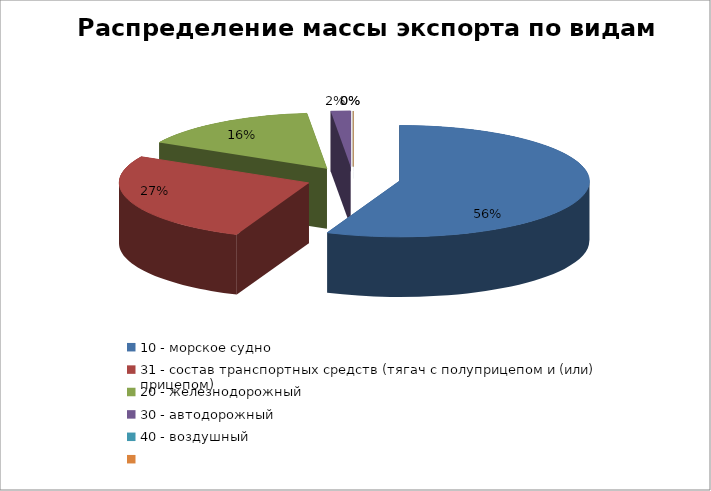
| Category | Масса, тонн |
|---|---|
| 10 - морское судно | 4586.574 |
| 31 - состав транспортных средств (тягач с полуприцепом и (или) прицепом) | 2170.773 |
| 20 - железнодорожный | 1267.325 |
| 30 - автодорожный | 136.895 |
| 40 - воздушный | 0.235 |